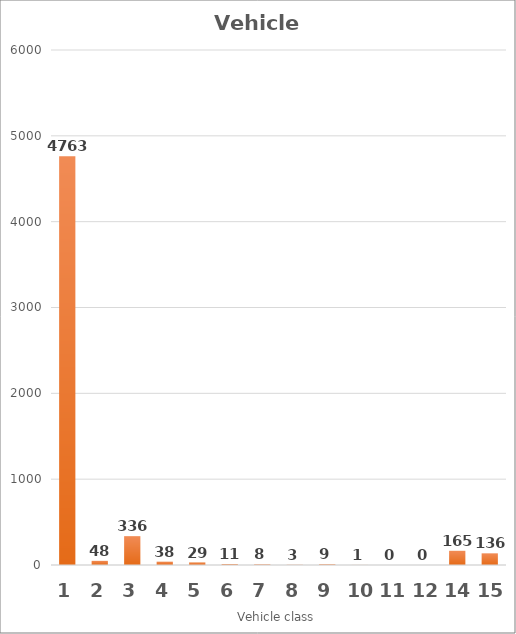
| Category | Series 0 |
|---|---|
| 1.0 | 4763 |
| 2.0 | 48 |
| 3.0 | 336 |
| 4.0 | 38 |
| 5.0 | 29 |
| 6.0 | 11 |
| 7.0 | 8 |
| 8.0 | 3 |
| 9.0 | 9 |
| 10.0 | 1 |
| 11.0 | 0 |
| 12.0 | 0 |
| 14.0 | 165 |
| 15.0 | 136 |